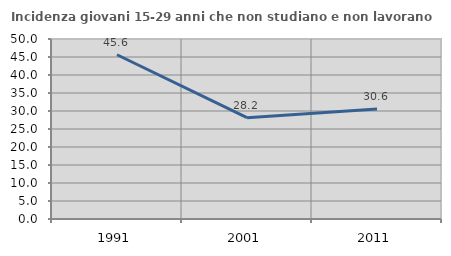
| Category | Incidenza giovani 15-29 anni che non studiano e non lavorano  |
|---|---|
| 1991.0 | 45.618 |
| 2001.0 | 28.155 |
| 2011.0 | 30.556 |